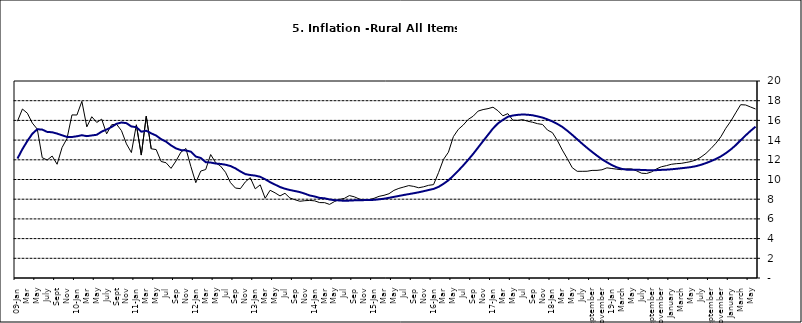
| Category | Series 0 | Series 1 |
|---|---|---|
| 09-Jan | 15.918 | 12.128 |
| Feb | 17.154 | 13.086 |
| Mar | 16.729 | 13.912 |
| Apr | 15.727 | 14.644 |
| May | 15.113 | 15.104 |
| June | 12.213 | 15.067 |
| July | 11.974 | 14.832 |
| Aug | 12.38 | 14.796 |
| Sept | 11.548 | 14.661 |
| Oct | 13.242 | 14.488 |
| Nov | 14.164 | 14.321 |
|  | 16.557 | 14.316 |
| 10-Jan | 16.548 | 14.39 |
| Feb | 17.934 | 14.494 |
| Mar | 15.346 | 14.401 |
| Apr | 16.373 | 14.473 |
| May | 15.794 | 14.54 |
| June | 16.126 | 14.862 |
| July | 14.634 | 15.072 |
| Aug | 15.556 | 15.33 |
| Sept | 15.616 | 15.658 |
| Oct | 14.955 | 15.786 |
| Nov | 13.616 | 15.719 |
| Dec | 12.735 | 15.385 |
| 11-Jan | 15.553 | 15.311 |
| Feb | 12.482 | 14.856 |
| Mar | 16.422 | 14.956 |
| Apr | 13.117 | 14.687 |
| May | 13.041 | 14.457 |
| Jun | 11.83 | 14.095 |
| Jul | 11.699 | 13.84 |
| Aug | 11.13 | 13.464 |
| Sep | 11.878 | 13.156 |
| Oct | 12.778 | 12.985 |
| Nov | 13.147 | 12.95 |
| Dec | 11.326 | 12.824 |
| 12-Jan | 9.678 | 12.33 |
| Feb | 10.856 | 12.188 |
| Mar | 11.014 | 11.76 |
| Apr | 12.536 | 11.724 |
| May | 11.712 | 11.621 |
| Jun | 11.36 | 11.582 |
| Jul | 10.733 | 11.499 |
| Aug | 9.683 | 11.368 |
| Sep | 9.132 | 11.131 |
| Oct | 9.071 | 10.82 |
| Nov | 9.758 | 10.548 |
| Dec | 10.183 | 10.455 |
| 13-Jan | 9.052 | 10.394 |
| Feb | 9.457 | 10.276 |
| Mar | 8.091 | 10.025 |
| Apr | 8.907 | 9.732 |
| May | 8.647 | 9.483 |
| Jun | 8.333 | 9.236 |
| Jul | 8.6 | 9.063 |
| Aug | 8.12 | 8.933 |
| Sep | 7.95 | 8.832 |
| Oct | 7.791 | 8.722 |
| Nov | 7.849 | 8.565 |
| Dec | 7.879 | 8.378 |
| 14-Jan | 7.832 | 8.277 |
| Feb | 7.657 | 8.13 |
| Mar | 7.65 | 8.092 |
| Apr | 7.473 | 7.973 |
| May | 7.761 | 7.901 |
| Jun | 7.98 | 7.874 |
| Jul | 8.086 | 7.834 |
| Aug | 8.368 | 7.858 |
| Sep | 8.244 | 7.883 |
| Oct | 8.019 | 7.903 |
| Nov | 7.898 | 7.906 |
| Dec | 7.955 | 7.913 |
| 15-Jan | 8.094 | 7.935 |
| Feb | 8.291 | 7.988 |
| Mar | 8.396 | 8.05 |
| Apr | 8.556 | 8.14 |
| May | 8.896 | 8.236 |
| Jun | 9.098 | 8.331 |
| Jul | 9.238 | 8.429 |
| Aug | 9.382 | 8.516 |
| Sep | 9.3 | 8.606 |
| Oct | 9.162 | 8.7 |
| Nov | 9.261 | 8.813 |
| Dec | 9.41 | 8.933 |
| 16-Jan | 9.48 | 9.047 |
| Feb | 10.692 | 9.249 |
| Mar | 12.038 | 9.559 |
| Apr | 12.767 | 9.917 |
| May | 14.349 | 10.384 |
| Jun | 15.088 | 10.897 |
| Jul | 15.533 | 11.433 |
| Aug | 16.103 | 12.002 |
| Sep | 16.428 | 12.601 |
| Oct | 16.947 | 13.25 |
| Nov | 17.099 | 13.898 |
| Dec | 17.195 | 14.54 |
| 17-Jan | 17.341 | 15.183 |
| Feb | 16.982 | 15.696 |
| Mar | 16.466 | 16.054 |
| Apr | 16.687 | 16.369 |
| May | 16.023 | 16.497 |
| Jun | 16.007 | 16.563 |
| Jul | 16.078 | 16.6 |
| Aug | 15.914 | 16.577 |
| Sep | 15.812 | 16.52 |
| Oct | 15.666 | 16.411 |
| Nov | 15.587 | 16.285 |
| Dec | 15.018 | 16.104 |
| 18-Jan | 14.756 | 15.892 |
| Feb | 13.957 | 15.638 |
| Mar | 12.987 | 15.339 |
| Apr | 12.126 | 14.95 |
| May | 11.199 | 14.53 |
| June | 10.832 | 14.083 |
| July | 10.831 | 13.636 |
| August | 10.838 | 13.209 |
| September | 10.924 | 12.804 |
| October | 10.927 | 12.418 |
| November | 10.986 | 12.049 |
| December | 11.183 | 11.746 |
| 19-Jan | 11.115 | 11.462 |
| February | 11.048 | 11.234 |
| March | 10.99 | 11.078 |
| April | 11.08 | 10.997 |
| May | 11.075 | 10.988 |
| June | 10.874 | 10.99 |
| July | 10.636 | 10.972 |
| August | 10.609 | 10.951 |
| September | 10.771 | 10.937 |
| October | 11.074 | 10.95 |
| November | 11.296 | 10.977 |
| December | 11.406 | 10.998 |
| January | 11.543 | 11.037 |
| February | 11.606 | 11.086 |
| March | 11.639 | 11.141 |
| April | 11.728 | 11.197 |
| May | 11.826 | 11.261 |
| June | 11.988 | 11.355 |
| July | 12.28 | 11.493 |
| August | 12.651 | 11.664 |
| September | 13.14 | 11.864 |
| October | 13.68 | 12.086 |
| November | 14.335 | 12.346 |
| December | 15.2 | 12.67 |
| January | 15.918 | 13.043 |
| February | 16.766 | 13.482 |
| March | 17.596 | 13.985 |
| April | 17.566 | 14.475 |
| May | 17.358 | 14.935 |
| June | 17.159 | 15.362 |